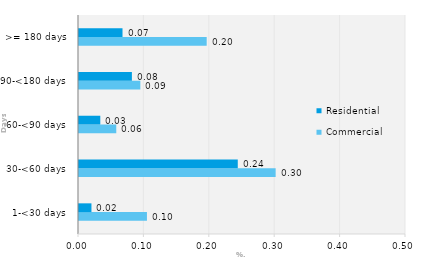
| Category | Commercial | Residential |
|---|---|---|
| 1-<30 days | 0.104 | 0.019 |
| 30-<60 days | 0.301 | 0.243 |
| 60-<90 days | 0.057 | 0.033 |
| 90-<180 days | 0.094 | 0.081 |
| >= 180 days | 0.195 | 0.067 |